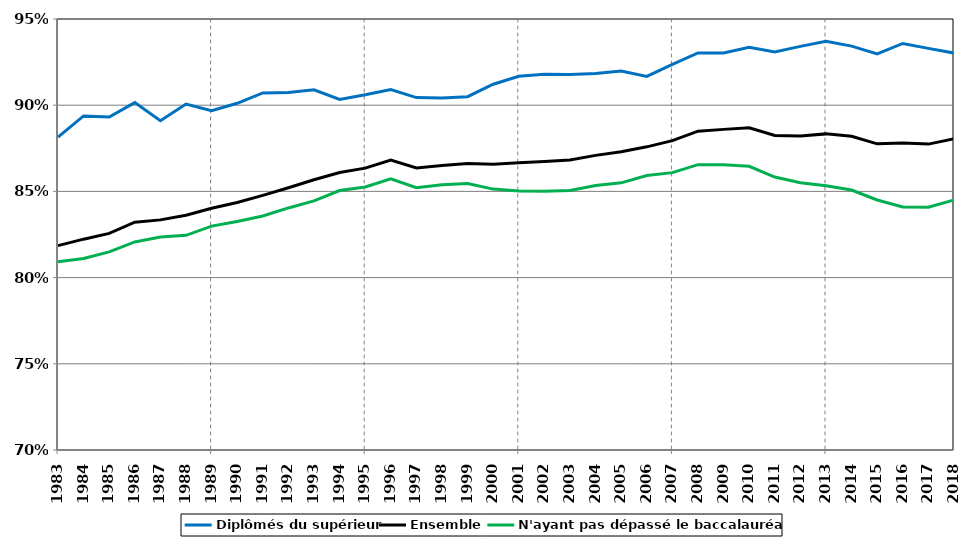
| Category | Diplômés du supérieur | Ensemble | N'ayant pas dépassé le baccalauréat* |
|---|---|---|---|
| 1983.0 | 0.882 | 0.819 | 0.809 |
| 1984.0 | 0.894 | 0.822 | 0.811 |
| 1985.0 | 0.893 | 0.826 | 0.815 |
| 1986.0 | 0.901 | 0.832 | 0.821 |
| 1987.0 | 0.891 | 0.833 | 0.824 |
| 1988.0 | 0.901 | 0.836 | 0.825 |
| 1989.0 | 0.897 | 0.84 | 0.83 |
| 1990.0 | 0.901 | 0.844 | 0.833 |
| 1991.0 | 0.907 | 0.848 | 0.836 |
| 1992.0 | 0.907 | 0.852 | 0.84 |
| 1993.0 | 0.909 | 0.857 | 0.844 |
| 1994.0 | 0.903 | 0.861 | 0.851 |
| 1995.0 | 0.906 | 0.864 | 0.853 |
| 1996.0 | 0.909 | 0.868 | 0.857 |
| 1997.0 | 0.904 | 0.864 | 0.852 |
| 1998.0 | 0.904 | 0.865 | 0.854 |
| 1999.0 | 0.905 | 0.866 | 0.855 |
| 2000.0 | 0.912 | 0.866 | 0.851 |
| 2001.0 | 0.917 | 0.867 | 0.85 |
| 2002.0 | 0.918 | 0.867 | 0.85 |
| 2003.0 | 0.918 | 0.868 | 0.851 |
| 2004.0 | 0.918 | 0.871 | 0.853 |
| 2005.0 | 0.92 | 0.873 | 0.855 |
| 2006.0 | 0.917 | 0.876 | 0.859 |
| 2007.0 | 0.924 | 0.879 | 0.861 |
| 2008.0 | 0.93 | 0.885 | 0.866 |
| 2009.0 | 0.93 | 0.886 | 0.865 |
| 2010.0 | 0.934 | 0.887 | 0.865 |
| 2011.0 | 0.931 | 0.882 | 0.858 |
| 2012.0 | 0.934 | 0.882 | 0.855 |
| 2013.0 | 0.937 | 0.883 | 0.853 |
| 2014.0 | 0.934 | 0.882 | 0.851 |
| 2015.0 | 0.93 | 0.878 | 0.845 |
| 2016.0 | 0.936 | 0.878 | 0.841 |
| 2017.0 | 0.933 | 0.877 | 0.841 |
| 2018.0 | 0.93 | 0.881 | 0.845 |